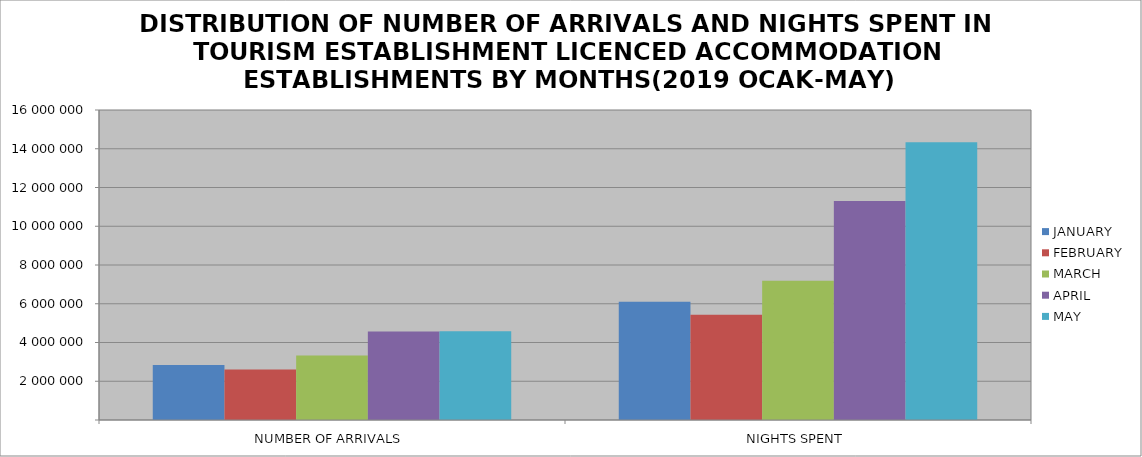
| Category | JANUARY | FEBRUARY | MARCH | APRIL | MAY |
|---|---|---|---|---|---|
| NUMBER OF ARRIVALS | 2833509 | 2607189 | 3326719 | 4561709 | 4585981 |
| NIGHTS SPENT | 6098050 | 5425989 | 7182593 | 11302946 | 14338328 |